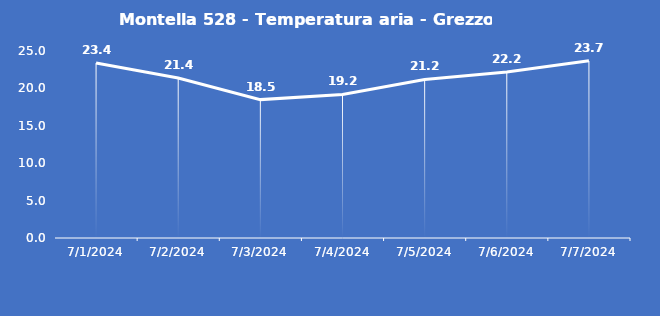
| Category | Montella 528 - Temperatura aria - Grezzo (°C) |
|---|---|
| 7/1/24 | 23.4 |
| 7/2/24 | 21.4 |
| 7/3/24 | 18.5 |
| 7/4/24 | 19.2 |
| 7/5/24 | 21.2 |
| 7/6/24 | 22.2 |
| 7/7/24 | 23.7 |